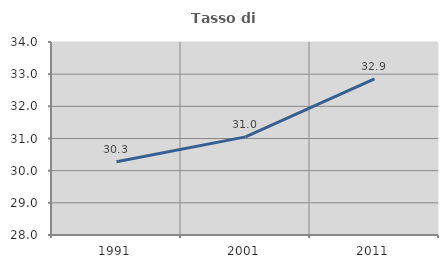
| Category | Tasso di occupazione   |
|---|---|
| 1991.0 | 30.28 |
| 2001.0 | 31.05 |
| 2011.0 | 32.85 |